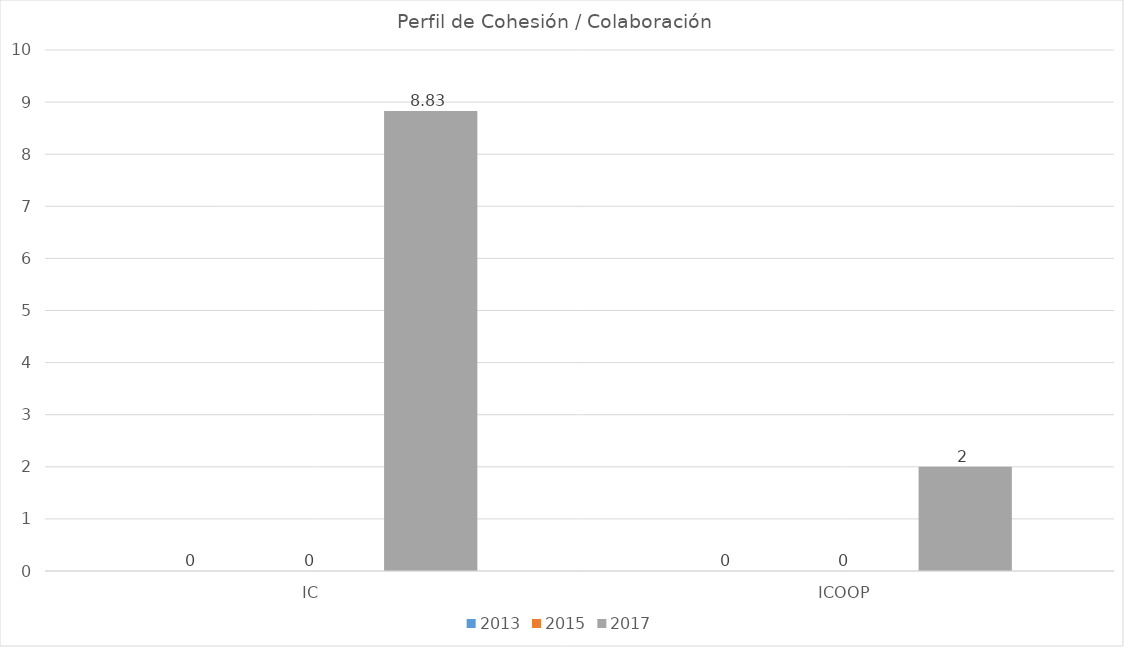
| Category | 2013 | 2015 | 2017 |
|---|---|---|---|
| IC | 0 | 0 | 8.83 |
| ICOOP | 0 | 0 | 2 |